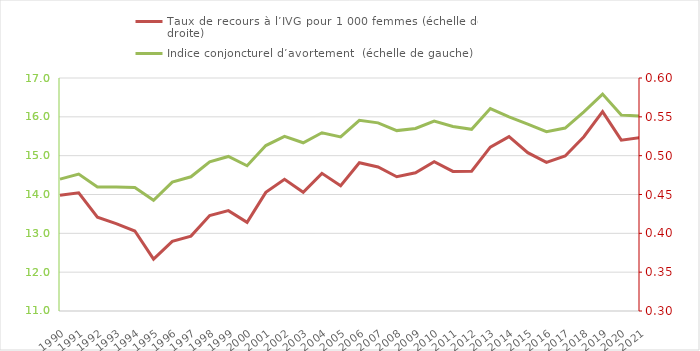
| Category | Taux de recours à l’IVG pour 1 000 femmes (échelle de droite) |
|---|---|
| 1990.0 | 13.982 |
| 1991.0 | 14.043 |
| 1992.0 | 13.416 |
| 1993.0 | 13.25 |
| 1994.0 | 13.059 |
| 1995.0 | 12.335 |
| 1996.0 | 12.794 |
| 1997.0 | 12.929 |
| 1998.0 | 13.459 |
| 1999.0 | 13.585 |
| 2000.0 | 13.282 |
| 2001.0 | 14.055 |
| 2002.0 | 14.39 |
| 2003.0 | 14.057 |
| 2004.0 | 14.544 |
| 2005.0 | 14.227 |
| 2006.0 | 14.817 |
| 2007.0 | 14.709 |
| 2008.0 | 14.456 |
| 2009.0 | 14.558 |
| 2010.0 | 14.845 |
| 2011.0 | 14.595 |
| 2012.0 | 14.598 |
| 2013.0 | 15.218 |
| 2014.0 | 15.489 |
| 2015.0 | 15.078 |
| 2016.0 | 14.825 |
| 2017.0 | 14.991 |
| 2018.0 | 15.488 |
| 2019.0 | 16.134 |
| 2020.0 | 15.399 |
| 2021.0 | 15.462 |